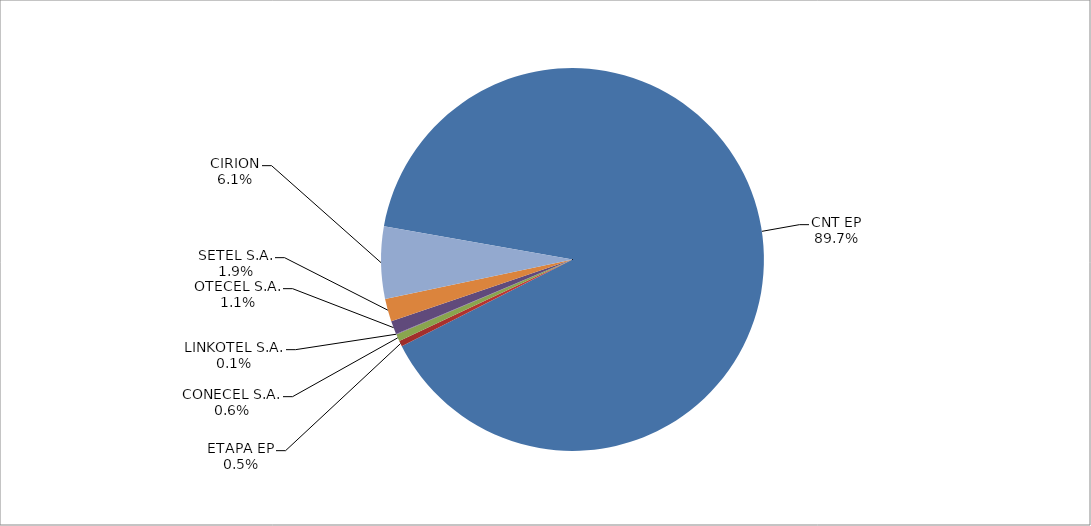
| Category | Series 0 |
|---|---|
| CNT EP | 3028 |
| ETAPA EP | 16 |
| CONECEL S.A. | 20 |
| LINKOTEL S.A. | 2 |
| OTECEL S.A. | 38 |
| SETEL S.A. | 65 |
| CIRION | 205 |